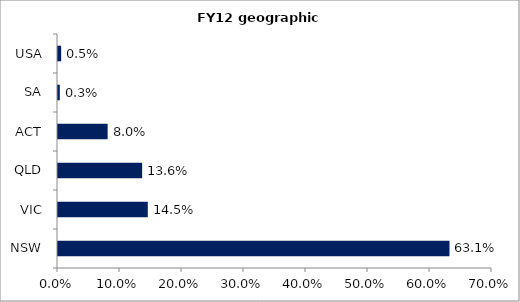
| Category | Series 0 |
|---|---|
| NSW | 0.631 |
| VIC | 0.145 |
| QLD | 0.136 |
| ACT | 0.08 |
| SA | 0.003 |
| USA | 0.005 |